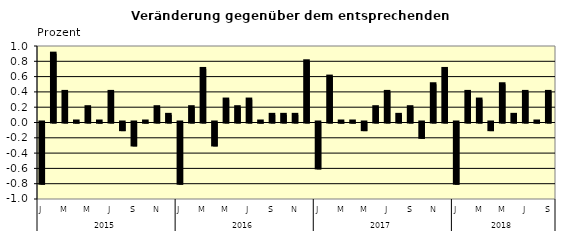
| Category | Series 0 |
|---|---|
| 0 | -0.8 |
| 1 | 0.9 |
| 2 | 0.4 |
| 3 | 0.01 |
| 4 | 0.2 |
| 5 | 0.01 |
| 6 | 0.4 |
| 7 | -0.1 |
| 8 | -0.3 |
| 9 | 0.01 |
| 10 | 0.2 |
| 11 | 0.1 |
| 12 | -0.8 |
| 13 | 0.2 |
| 14 | 0.7 |
| 15 | -0.3 |
| 16 | 0.3 |
| 17 | 0.2 |
| 18 | 0.3 |
| 19 | 0.01 |
| 20 | 0.1 |
| 21 | 0.1 |
| 22 | 0.1 |
| 23 | 0.8 |
| 24 | -0.6 |
| 25 | 0.6 |
| 26 | 0.01 |
| 27 | 0.01 |
| 28 | -0.1 |
| 29 | 0.2 |
| 30 | 0.4 |
| 31 | 0.1 |
| 32 | 0.2 |
| 33 | -0.2 |
| 34 | 0.5 |
| 35 | 0.7 |
| 36 | -0.8 |
| 37 | 0.4 |
| 38 | 0.3 |
| 39 | -0.1 |
| 40 | 0.5 |
| 41 | 0.1 |
| 42 | 0.4 |
| 43 | 0.01 |
| 44 | 0.4 |